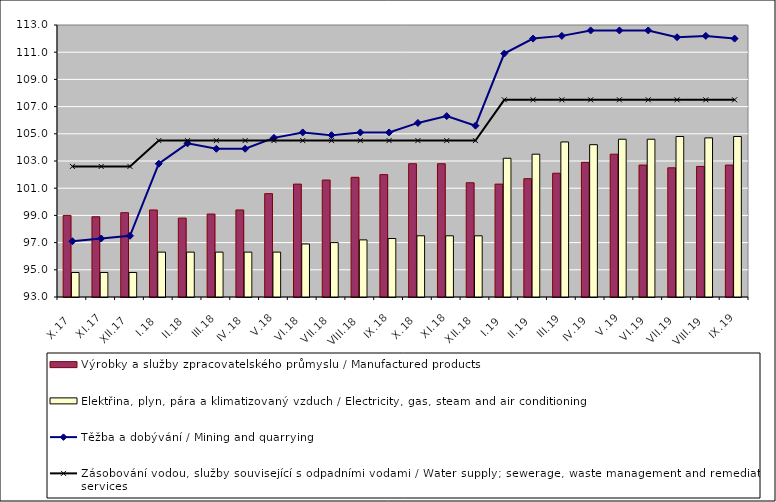
| Category | Výrobky a služby zpracovatelského průmyslu / Manufactured products | Elektřina, plyn, pára a klimatizovaný vzduch / Electricity, gas, steam and air conditioning |
|---|---|---|
| X.17 | 99 | 94.8 |
| XI.17 | 98.9 | 94.8 |
| XII.17 | 99.2 | 94.8 |
| I.18 | 99.4 | 96.3 |
| II.18 | 98.8 | 96.3 |
| III.18 | 99.1 | 96.3 |
| IV.18 | 99.4 | 96.3 |
| V.18 | 100.6 | 96.3 |
| VI.18 | 101.3 | 96.9 |
| VII.18 | 101.6 | 97 |
| VIII.18 | 101.8 | 97.2 |
| IX.18 | 102 | 97.3 |
| X.18 | 102.8 | 97.5 |
| XI.18 | 102.8 | 97.5 |
| XII.18 | 101.4 | 97.5 |
| I.19 | 101.3 | 103.2 |
| II.19 | 101.7 | 103.5 |
| III.19 | 102.1 | 104.4 |
| IV.19 | 102.9 | 104.2 |
| V.19 | 103.5 | 104.6 |
| VI.19 | 102.7 | 104.6 |
| VII.19 | 102.5 | 104.8 |
| VIII.19 | 102.6 | 104.7 |
| IX.19 | 102.7 | 104.8 |